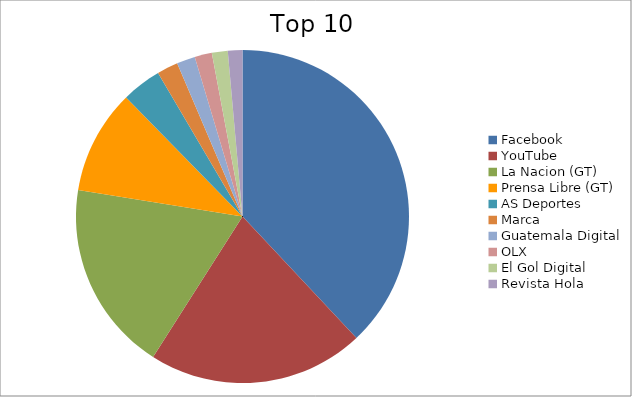
| Category | Series 0 |
|---|---|
| Facebook | 29.31 |
| YouTube | 16.21 |
| La Nacion (GT) | 14.29 |
| Prensa Libre (GT) | 7.81 |
| AS Deportes | 2.97 |
| Marca | 1.58 |
| Guatemala Digital | 1.38 |
| OLX | 1.29 |
| El Gol Digital | 1.19 |
| Revista Hola | 1.09 |